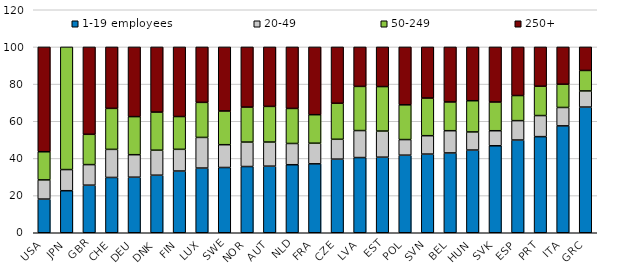
| Category | 1-19 employees | 20-49 | 50-249 | 250+ |
|---|---|---|---|---|
| USA | 18.113 | 10.335 | 15.124 | 56.428 |
| JPN | 22.619 | 11.381 | 66 | 0 |
| GBR | 25.607 | 11.061 | 16.312 | 47.021 |
| CHE | 29.758 | 15.114 | 22.059 | 33.07 |
| DEU | 29.894 | 12.111 | 20.489 | 37.506 |
| DNK | 30.971 | 13.456 | 20.504 | 35.069 |
| FIN | 33.215 | 11.68 | 17.643 | 37.462 |
| LUX | 34.813 | 16.489 | 18.861 | 29.837 |
| SWE | 35.118 | 12.263 | 18.142 | 34.478 |
| NOR | 35.635 | 13.164 | 18.82 | 32.381 |
| AUT | 35.831 | 12.983 | 19.182 | 32.004 |
| NLD | 36.607 | 11.434 | 18.86 | 33.1 |
| FRA | 37.095 | 11.097 | 15.334 | 36.474 |
| CZE | 39.613 | 10.692 | 19.375 | 30.321 |
| LVA | 40.461 | 14.534 | 23.758 | 21.247 |
| EST | 40.668 | 14.067 | 23.927 | 21.338 |
| POL | 41.753 | 8.388 | 18.703 | 31.156 |
| SVN | 42.335 | 9.889 | 20.257 | 27.52 |
| BEL | 42.944 | 11.97 | 15.465 | 29.621 |
| HUN | 44.509 | 9.743 | 16.794 | 28.954 |
| SVK | 46.803 | 8.102 | 15.454 | 29.641 |
| ESP | 49.899 | 10.43 | 13.507 | 26.163 |
| PRT | 51.718 | 11.346 | 15.786 | 21.15 |
| ITA | 57.515 | 9.903 | 12.504 | 20.078 |
| GRC | 67.633 | 8.693 | 11.007 | 12.668 |